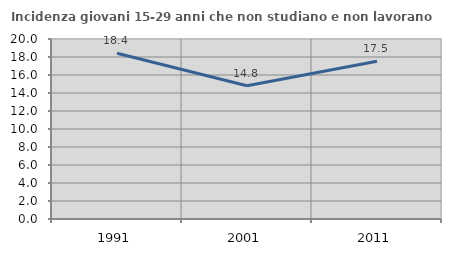
| Category | Incidenza giovani 15-29 anni che non studiano e non lavorano  |
|---|---|
| 1991.0 | 18.418 |
| 2001.0 | 14.802 |
| 2011.0 | 17.534 |